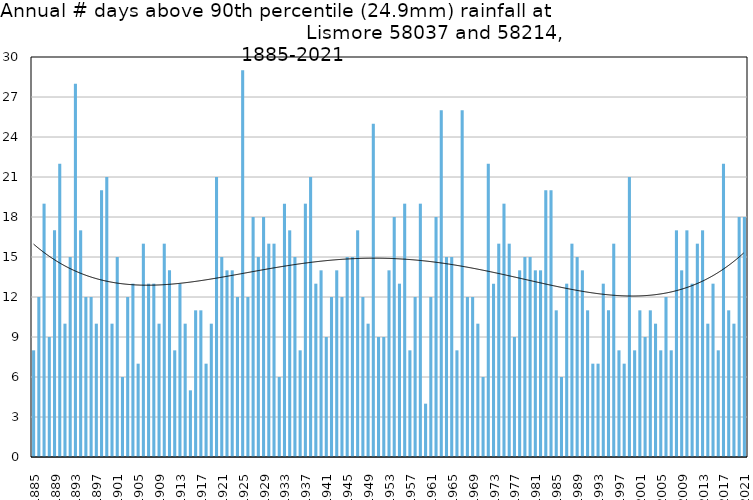
| Category | Annual # days above 90th percentile |
|---|---|
| 1885 | 8 |
| 1886 | 12 |
| 1887 | 19 |
| 1888 | 9 |
| 1889 | 17 |
| 1890 | 22 |
| 1891 | 10 |
| 1892 | 15 |
| 1893 | 28 |
| 1894 | 17 |
| 1895 | 12 |
| 1896 | 12 |
| 1897 | 10 |
| 1898 | 20 |
| 1899 | 21 |
| 1900 | 10 |
| 1901 | 15 |
| 1902 | 6 |
| 1903 | 12 |
| 1904 | 13 |
| 1905 | 7 |
| 1906 | 16 |
| 1907 | 13 |
| 1908 | 13 |
| 1909 | 10 |
| 1910 | 16 |
| 1911 | 14 |
| 1912 | 8 |
| 1913 | 13 |
| 1914 | 10 |
| 1915 | 5 |
| 1916 | 11 |
| 1917 | 11 |
| 1918 | 7 |
| 1919 | 10 |
| 1920 | 21 |
| 1921 | 15 |
| 1922 | 14 |
| 1923 | 14 |
| 1924 | 12 |
| 1925 | 29 |
| 1926 | 12 |
| 1927 | 18 |
| 1928 | 15 |
| 1929 | 18 |
| 1930 | 16 |
| 1931 | 16 |
| 1932 | 6 |
| 1933 | 19 |
| 1934 | 17 |
| 1935 | 15 |
| 1936 | 8 |
| 1937 | 19 |
| 1938 | 21 |
| 1939 | 13 |
| 1940 | 14 |
| 1941 | 9 |
| 1942 | 12 |
| 1943 | 14 |
| 1944 | 12 |
| 1945 | 15 |
| 1946 | 15 |
| 1947 | 17 |
| 1948 | 12 |
| 1949 | 10 |
| 1950 | 25 |
| 1951 | 9 |
| 1952 | 9 |
| 1953 | 14 |
| 1954 | 18 |
| 1955 | 13 |
| 1956 | 19 |
| 1957 | 8 |
| 1958 | 12 |
| 1959 | 19 |
| 1960 | 4 |
| 1961 | 12 |
| 1962 | 18 |
| 1963 | 26 |
| 1964 | 15 |
| 1965 | 15 |
| 1966 | 8 |
| 1967 | 26 |
| 1968 | 12 |
| 1969 | 12 |
| 1970 | 10 |
| 1971 | 6 |
| 1972 | 22 |
| 1973 | 13 |
| 1974 | 16 |
| 1975 | 19 |
| 1976 | 16 |
| 1977 | 9 |
| 1978 | 14 |
| 1979 | 15 |
| 1980 | 15 |
| 1981 | 14 |
| 1982 | 14 |
| 1983 | 20 |
| 1984 | 20 |
| 1985 | 11 |
| 1986 | 6 |
| 1987 | 13 |
| 1988 | 16 |
| 1989 | 15 |
| 1990 | 14 |
| 1991 | 11 |
| 1992 | 7 |
| 1993 | 7 |
| 1994 | 13 |
| 1995 | 11 |
| 1996 | 16 |
| 1997 | 8 |
| 1998 | 7 |
| 1999 | 21 |
| 2000 | 8 |
| 2001 | 11 |
| 2002 | 9 |
| 2003 | 11 |
| 2004 | 10 |
| 2005 | 8 |
| 2006 | 12 |
| 2007 | 8 |
| 2008 | 17 |
| 2009 | 14 |
| 2010 | 17 |
| 2011 | 13 |
| 2012 | 16 |
| 2013 | 17 |
| 2014 | 10 |
| 2015 | 13 |
| 2016 | 8 |
| 2017 | 22 |
| 2018 | 11 |
| 2019 | 10 |
| 2020 | 18 |
| 2021 | 18 |